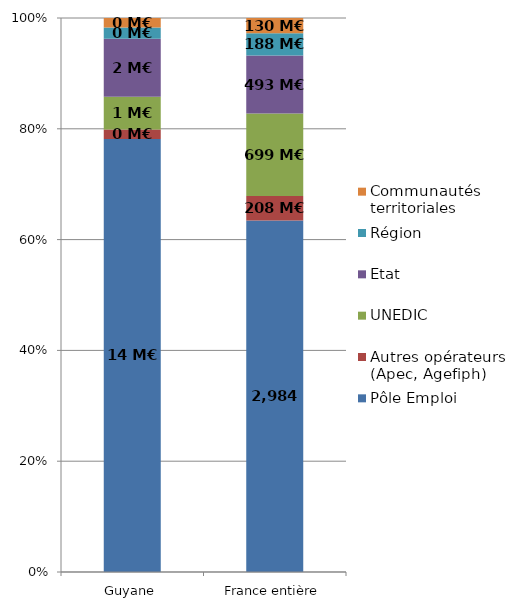
| Category | Pôle Emploi | Autres opérateurs (Apec, Agefiph) | UNEDIC | Etat | Région | Communautés territoriales |
|---|---|---|---|---|---|---|
| Guyane | 14.102 | 0.308 | 1.067 | 1.887 | 0.366 | 0.309 |
| France entière | 2983.694 | 207.577 | 699.479 | 493.308 | 188.079 | 129.71 |